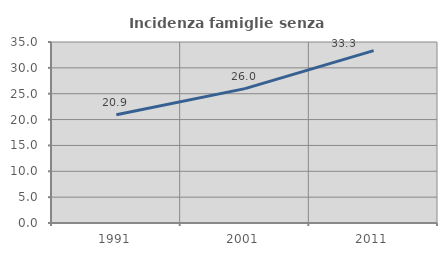
| Category | Incidenza famiglie senza nuclei |
|---|---|
| 1991.0 | 20.94 |
| 2001.0 | 25.986 |
| 2011.0 | 33.33 |